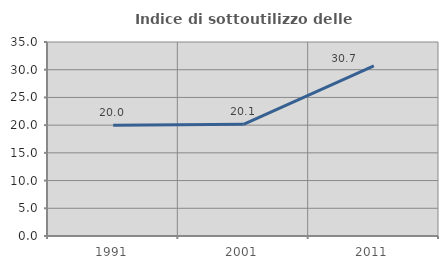
| Category | Indice di sottoutilizzo delle abitazioni  |
|---|---|
| 1991.0 | 20 |
| 2001.0 | 20.148 |
| 2011.0 | 30.675 |